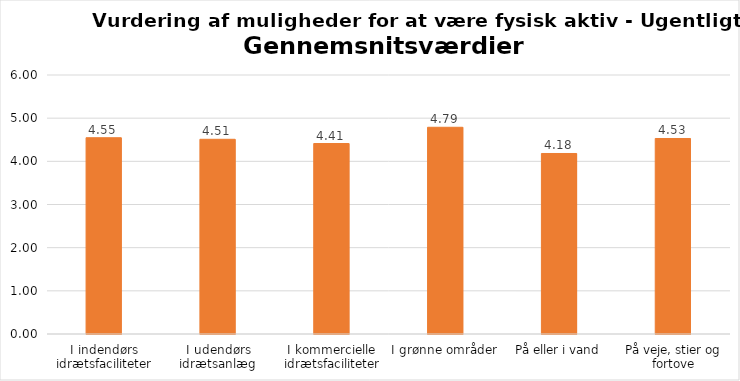
| Category | Gennemsnit |
|---|---|
| I indendørs idrætsfaciliteter | 4.547 |
| I udendørs idrætsanlæg | 4.511 |
| I kommercielle idrætsfaciliteter | 4.412 |
| I grønne områder | 4.789 |
| På eller i vand | 4.182 |
| På veje, stier og fortove | 4.529 |